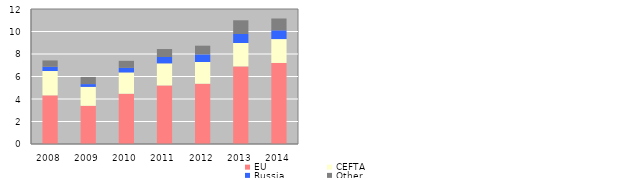
| Category | EU | CEFTА | Russia | Other |
|---|---|---|---|---|
| 2008.0 | 4322.989 | 2163.402 | 374.123 | 568.332 |
| 2009.0 | 3394.805 | 1682.188 | 249.277 | 635.023 |
| 2010.0 | 4466.809 | 1894.451 | 403.393 | 628.719 |
| 2011.0 | 5204.111 | 1962.798 | 567.724 | 706.789 |
| 2012.0 | 5357.218 | 1932.332 | 675.712 | 773.599 |
| 2013.0 | 6898.54 | 2079.347 | 799.883 | 1218.936 |
| 2014.0 | 7204.16 | 2123.441 | 774.464 | 1054.973 |